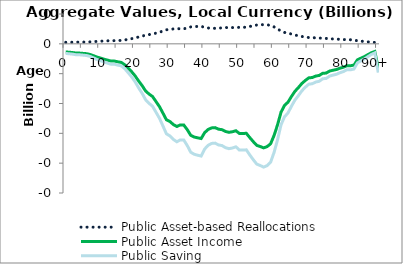
| Category | Public Asset-based Reallocations | Public Asset Income | Public Saving |
|---|---|---|---|
| 0 | 0.003 | -0.014 | -0.016 |
|  | 0.003 | -0.014 | -0.017 |
| 2 | 0.003 | -0.015 | -0.017 |
| 3 | 0.003 | -0.015 | -0.018 |
| 4 | 0.003 | -0.016 | -0.018 |
| 5 | 0.003 | -0.016 | -0.019 |
| 6 | 0.003 | -0.017 | -0.02 |
| 7 | 0.003 | -0.018 | -0.021 |
| 8 | 0.004 | -0.02 | -0.024 |
| 9 | 0.004 | -0.022 | -0.026 |
| 10 | 0.004 | -0.024 | -0.028 |
| 11 | 0.005 | -0.026 | -0.03 |
| 12 | 0.005 | -0.027 | -0.032 |
| 13 | 0.005 | -0.029 | -0.034 |
| 14 | 0.005 | -0.029 | -0.034 |
| 15 | 0.006 | -0.03 | -0.036 |
| 16 | 0.006 | -0.031 | -0.037 |
| 17 | 0.007 | -0.035 | -0.042 |
| 18 | 0.008 | -0.041 | -0.048 |
| 19 | 0.009 | -0.047 | -0.056 |
| 20 | 0.01 | -0.054 | -0.064 |
| 21 | 0.012 | -0.062 | -0.074 |
| 22 | 0.013 | -0.07 | -0.083 |
| 23 | 0.015 | -0.079 | -0.094 |
| 24 | 0.016 | -0.084 | -0.1 |
| 25 | 0.016 | -0.088 | -0.105 |
| 26 | 0.018 | -0.097 | -0.115 |
| 27 | 0.019 | -0.105 | -0.125 |
| 28 | 0.021 | -0.116 | -0.138 |
| 29 | 0.024 | -0.127 | -0.151 |
| 30 | 0.024 | -0.13 | -0.154 |
| 31 | 0.025 | -0.135 | -0.16 |
| 32 | 0.026 | -0.138 | -0.164 |
| 33 | 0.025 | -0.136 | -0.161 |
| 34 | 0.025 | -0.136 | -0.161 |
| 35 | 0.027 | -0.144 | -0.171 |
| 36 | 0.028 | -0.153 | -0.182 |
| 37 | 0.029 | -0.156 | -0.185 |
| 38 | 0.029 | -0.158 | -0.187 |
| 39 | 0.029 | -0.159 | -0.188 |
| 40 | 0.028 | -0.149 | -0.176 |
| 41 | 0.027 | -0.144 | -0.17 |
| 42 | 0.026 | -0.141 | -0.167 |
| 43 | 0.026 | -0.14 | -0.166 |
| 44 | 0.026 | -0.143 | -0.169 |
| 45 | 0.027 | -0.144 | -0.17 |
| 46 | 0.027 | -0.147 | -0.174 |
| 47 | 0.027 | -0.148 | -0.176 |
| 48 | 0.027 | -0.147 | -0.175 |
| 49 | 0.027 | -0.146 | -0.173 |
| 50 | 0.028 | -0.15 | -0.178 |
| 51 | 0.028 | -0.15 | -0.178 |
| 52 | 0.028 | -0.15 | -0.178 |
| 53 | 0.029 | -0.157 | -0.186 |
| 54 | 0.03 | -0.164 | -0.194 |
| 55 | 0.031 | -0.17 | -0.202 |
| 56 | 0.032 | -0.172 | -0.204 |
| 57 | 0.032 | -0.174 | -0.207 |
| 58 | 0.032 | -0.172 | -0.204 |
| 59 | 0.031 | -0.167 | -0.198 |
| 60 | 0.028 | -0.153 | -0.182 |
| 61 | 0.025 | -0.136 | -0.161 |
| 62 | 0.021 | -0.115 | -0.136 |
| 63 | 0.019 | -0.103 | -0.122 |
| 64 | 0.018 | -0.098 | -0.116 |
| 65 | 0.016 | -0.088 | -0.105 |
| 66 | 0.015 | -0.08 | -0.094 |
| 67 | 0.014 | -0.073 | -0.087 |
| 68 | 0.012 | -0.066 | -0.079 |
| 69 | 0.011 | -0.061 | -0.073 |
| 70 | 0.011 | -0.057 | -0.068 |
| 71 | 0.01 | -0.056 | -0.067 |
| 72 | 0.01 | -0.054 | -0.064 |
| 73 | 0.01 | -0.053 | -0.063 |
| 74 | 0.009 | -0.049 | -0.058 |
| 75 | 0.009 | -0.049 | -0.058 |
| 76 | 0.008 | -0.046 | -0.054 |
| 77 | 0.008 | -0.044 | -0.052 |
| 78 | 0.008 | -0.043 | -0.051 |
| 79 | 0.008 | -0.041 | -0.048 |
| 80 | 0.007 | -0.039 | -0.046 |
| 81 | 0.007 | -0.037 | -0.043 |
| 82 | 0.007 | -0.037 | -0.044 |
| 83 | 0.007 | -0.036 | -0.042 |
| 84 | 0.005 | -0.027 | -0.032 |
| 85 | 0.004 | -0.024 | -0.028 |
| 86 | 0.004 | -0.021 | -0.025 |
| 87 | 0.003 | -0.018 | -0.021 |
| 88 | 0.003 | -0.015 | -0.018 |
| 89 | 0.002 | -0.013 | -0.015 |
| 90+ | 0.008 | -0.041 | -0.048 |